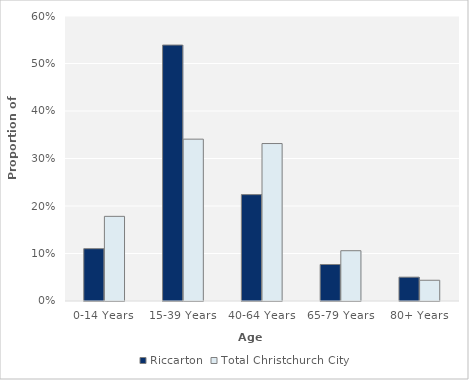
| Category | Riccarton | Total Christchurch City |
|---|---|---|
| 0-14 Years | 0.11 | 0.178 |
| 15-39 Years | 0.539 | 0.341 |
| 40-64 Years | 0.224 | 0.331 |
| 65-79 Years | 0.077 | 0.106 |
| 80+ Years | 0.05 | 0.044 |